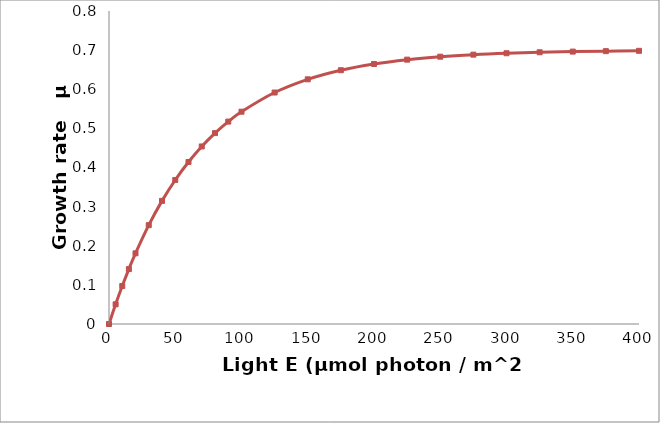
| Category | Series 1 |
|---|---|
| 0.0 | 0 |
| 5.0 | 0.05 |
| 10.0 | 0.097 |
| 15.0 | 0.14 |
| 20.0 | 0.181 |
| 30.0 | 0.253 |
| 40.0 | 0.315 |
| 50.0 | 0.368 |
| 60.0 | 0.414 |
| 70.0 | 0.454 |
| 80.0 | 0.488 |
| 90.0 | 0.517 |
| 100.0 | 0.543 |
| 125.0 | 0.592 |
| 150.0 | 0.625 |
| 175.0 | 0.649 |
| 200.0 | 0.665 |
| 225.0 | 0.676 |
| 250.0 | 0.683 |
| 275.0 | 0.688 |
| 300.0 | 0.692 |
| 325.0 | 0.695 |
| 350.0 | 0.696 |
| 375.0 | 0.697 |
| 400.0 | 0.698 |